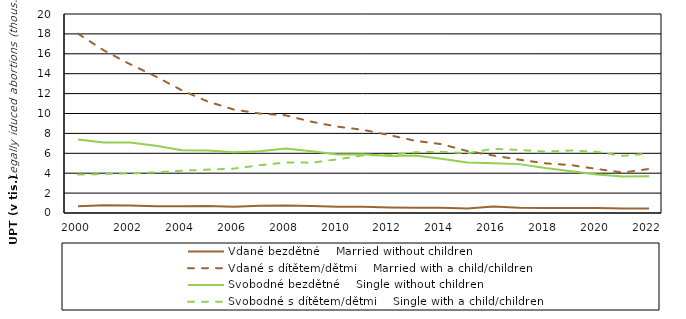
| Category | Vdané bezdětné    Married without children | Vdané s dítětem/dětmi    Married with a child/children | Svobodné bezdětné    Single without children | Svobodné s dítětem/dětmi    Single with a child/children |
|---|---|---|---|---|
| 2000.0 | 666 | 18027 | 7389 | 3857 |
| 2001.0 | 791 | 16339 | 7092 | 3924 |
| 2002.0 | 753 | 14963 | 7080 | 3973 |
| 2003.0 | 688 | 13716 | 6764 | 4088 |
| 2004.0 | 677 | 12334 | 6307 | 4244 |
| 2005.0 | 696 | 11205 | 6283 | 4363 |
| 2006.0 | 640 | 10402 | 6096 | 4456 |
| 2007.0 | 720 | 9996 | 6217 | 4799 |
| 2008.0 | 743 | 9813 | 6482 | 5080 |
| 2009.0 | 701 | 9172 | 6213 | 5058 |
| 2010.0 | 618 | 8678 | 5890 | 5393 |
| 2011.0 | 640 | 8353 | 5897 | 5796 |
| 2012.0 | 562 | 7823 | 5736 | 5830 |
| 2013.0 | 520 | 7254 | 5781 | 6102 |
| 2014.0 | 540 | 6919 | 5455 | 6149 |
| 2015.0 | 459 | 6228 | 5067 | 6000 |
| 2016.0 | 643 | 5778 | 5008 | 6455 |
| 2017.0 | 532 | 5359 | 4912 | 6335 |
| 2018.0 | 512 | 4994 | 4524 | 6173 |
| 2019.0 | 507 | 4814 | 4192 | 6277 |
| 2020.0 | 511 | 4420 | 3865 | 6145 |
| 2021.0 | 441 | 4067 | 3657 | 5739 |
| 2022.0 | 453 | 4426 | 3696 | 5980 |